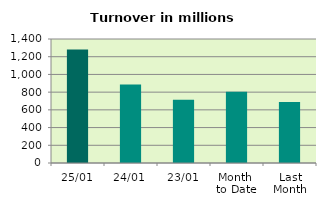
| Category | Series 0 |
|---|---|
| 25/01 | 1281.357 |
| 24/01 | 887.016 |
| 23/01 | 714.165 |
| Month 
to Date | 805.027 |
| Last
Month | 689.27 |